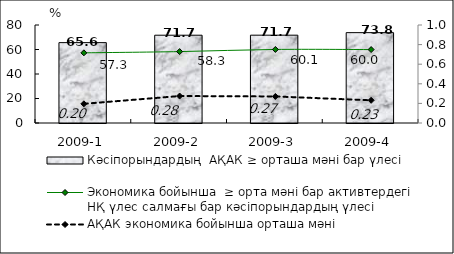
| Category | Кәсіпорындардың  АҚАК ≥ орташа мәні бар үлесі  |
|---|---|
| 2009-1 | 65.61 |
| 2009-2 | 71.67 |
| 2009-3 | 71.69 |
| 2009-4 | 73.76 |